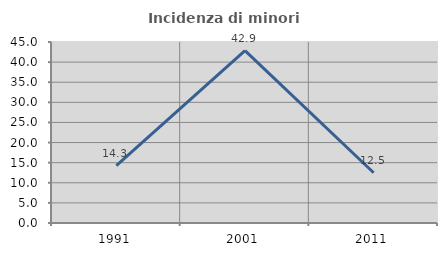
| Category | Incidenza di minori stranieri |
|---|---|
| 1991.0 | 14.286 |
| 2001.0 | 42.857 |
| 2011.0 | 12.5 |